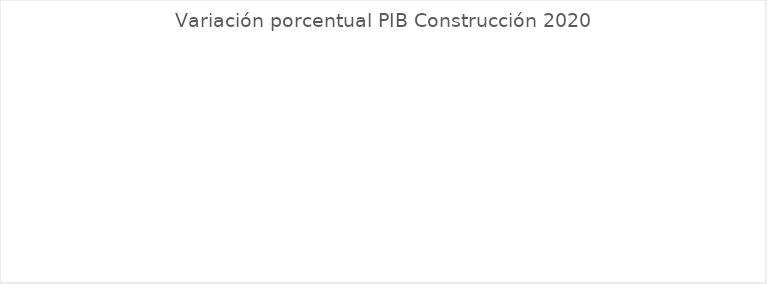
| Category | Variación porcentual PIB Construcción |
|---|---|
| Guaviare | -9.615 |
| Putumayo | -14.873 |
| Arauca | -15.191 |
| Caquetá | -15.943 |
| Cesar | -17.274 |
| La Guajira | -17.689 |
| Sucre | -17.92 |
| Norte de Santander | -19.176 |
| Nariño | -19.342 |
| Huila | -20.744 |
| Caldas | -20.972 |
| Risaralda | -21.13 |
| Casanare | -21.896 |
| Tolima | -22.23 |
| Guainía | -22.462 |
| San Andrés, Providencia y Santa Catalina (Archipiélago) | -23.261 |
| Boyacá | -23.394 |
| Cauca | -23.766 |
| Chocó | -24.39 |
| Vichada | -24.768 |
| Amazonas | -25.093 |
| Meta | -25.443 |
| Magdalena | -25.539 |
| COLOMBIA | -25.773 |
| Valle del Cauca | -26.183 |
| Atlántico | -26.888 |
| Córdoba | -26.972 |
| Cundinamarca | -27.062 |
| Bolívar | -27.507 |
| Vaupés | -27.72 |
| Bogotá D.C. | -28.175 |
| Antioquia | -28.215 |
| Santander | -28.74 |
| Quindío | -29.832 |